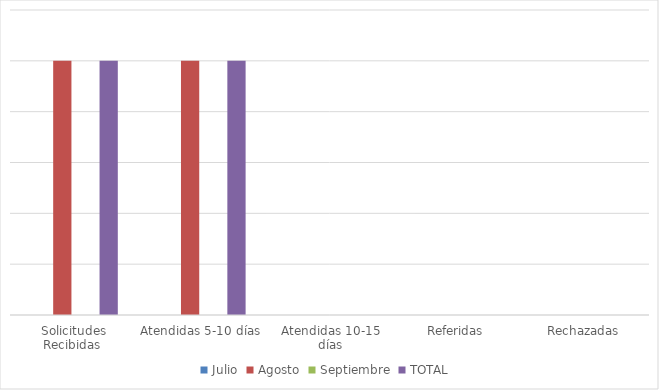
| Category | Julio | Agosto | Septiembre | TOTAL  |
|---|---|---|---|---|
| Solicitudes Recibidas  | 0 | 1 | 0 | 1 |
| Atendidas 5-10 días | 0 | 1 | 0 | 1 |
| Atendidas 10-15 días | 0 | 0 | 0 | 0 |
| Referidas | 0 | 0 | 0 | 0 |
| Rechazadas | 0 | 0 | 0 | 0 |